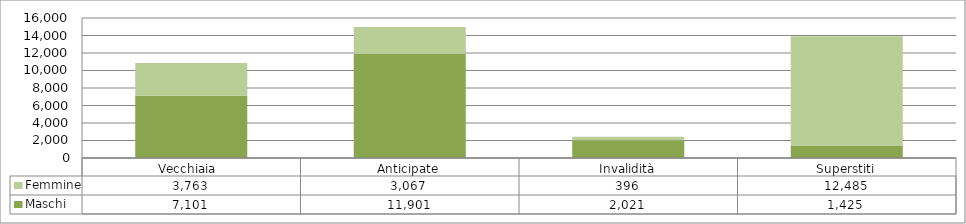
| Category | Maschi | Femmine |
|---|---|---|
| Vecchiaia  | 7101 | 3763 |
| Anticipate | 11901 | 3067 |
| Invalidità | 2021 | 396 |
| Superstiti | 1425 | 12485 |